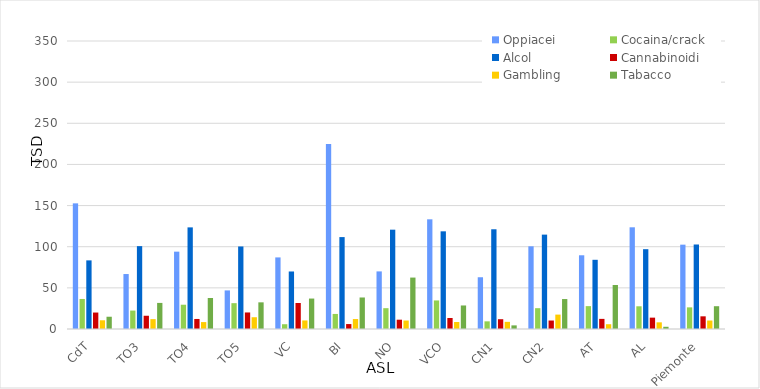
| Category | Oppiacei | Cocaina/crack | Alcol | Cannabinoidi | Gambling | Tabacco |
|---|---|---|---|---|---|---|
| CdT | 152.7 | 36.5 | 83.4 | 20 | 10.6 | 14.9 |
| TO3 | 66.8 | 22.4 | 100.7 | 16.1 | 12 | 31.7 |
| TO4 | 94 | 29.5 | 123.5 | 12.2 | 8.4 | 37.7 |
| TO5 | 46.9 | 31.4 | 100.3 | 20.1 | 14.3 | 32.4 |
| VC | 87 | 5.8 | 69.9 | 31.6 | 10.4 | 37 |
| BI | 224.9 | 18.3 | 111.7 | 6 | 12.1 | 38.3 |
| NO | 70 | 25.3 | 120.7 | 11.3 | 10.3 | 62.5 |
| VCO | 133.3 | 34.7 | 118.7 | 13.4 | 8.5 | 28.6 |
| CN1 | 62.9 | 9.3 | 121.2 | 11.9 | 8.7 | 4.4 |
| CN2 | 100.5 | 25.3 | 114.7 | 10.3 | 17.5 | 36.4 |
| AT | 89.6 | 27.8 | 84.1 | 12.3 | 5.8 | 53.5 |
| AL | 123.6 | 27.6 | 97 | 13.8 | 8.1 | 2.7 |
| Piemonte | 102.5 | 26.3 | 102.7 | 15.4 | 10.3 | 27.7 |